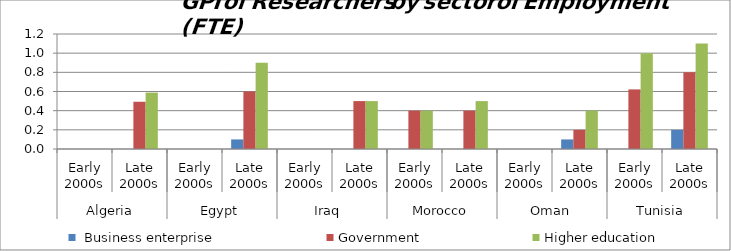
| Category |  Business enterprise | Government | Higher education |
|---|---|---|---|
| 0 | 0 | 0 | 0 |
| 1 | 0 | 0.493 | 0.589 |
| 2 | 0 | 0 | 0 |
| 3 | 0.1 | 0.6 | 0.9 |
| 4 | 0 | 0 | 0 |
| 5 | 0 | 0.5 | 0.5 |
| 6 | 0 | 0.4 | 0.4 |
| 7 | 0 | 0.4 | 0.5 |
| 8 | 0 | 0 | 0 |
| 9 | 0.1 | 0.2 | 0.4 |
| 10 | 0 | 0.622 | 1 |
| 11 | 0.2 | 0.8 | 1.1 |